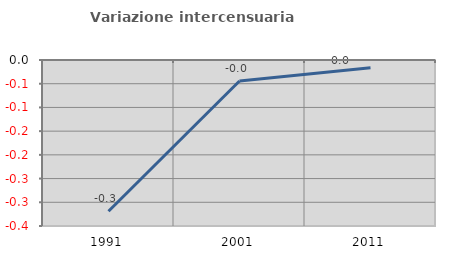
| Category | Variazione intercensuaria annua |
|---|---|
| 1991.0 | -0.319 |
| 2001.0 | -0.044 |
| 2011.0 | -0.016 |